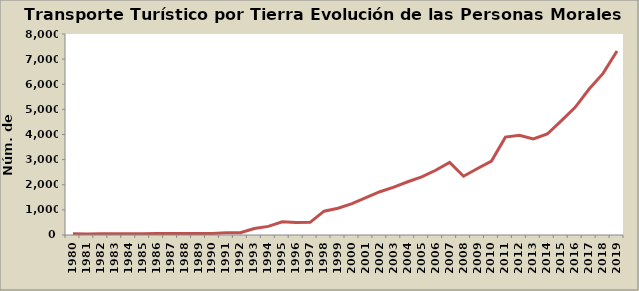
| Category | Series 0 |
|---|---|
| 1980.0 | 50 |
| 1981.0 | 44 |
| 1982.0 | 46 |
| 1983.0 | 54 |
| 1984.0 | 54 |
| 1985.0 | 51 |
| 1986.0 | 56 |
| 1987.0 | 56 |
| 1988.0 | 58 |
| 1989.0 | 60 |
| 1990.0 | 60 |
| 1991.0 | 85 |
| 1992.0 | 90 |
| 1993.0 | 261 |
| 1994.0 | 342 |
| 1995.0 | 523 |
| 1996.0 | 498 |
| 1997.0 | 503 |
| 1998.0 | 948 |
| 1999.0 | 1065 |
| 2000.0 | 1248 |
| 2001.0 | 1483 |
| 2002.0 | 1722 |
| 2003.0 | 1904 |
| 2004.0 | 2120 |
| 2005.0 | 2311 |
| 2006.0 | 2577 |
| 2007.0 | 2888 |
| 2008.0 | 2338 |
| 2009.0 | 2649 |
| 2010.0 | 2942 |
| 2011.0 | 3895 |
| 2012.0 | 3972 |
| 2013.0 | 3820 |
| 2014.0 | 4020 |
| 2015.0 | 4542 |
| 2016.0 | 5080 |
| 2017.0 | 5809 |
| 2018.0 | 6432 |
| 2019.0 | 7325 |